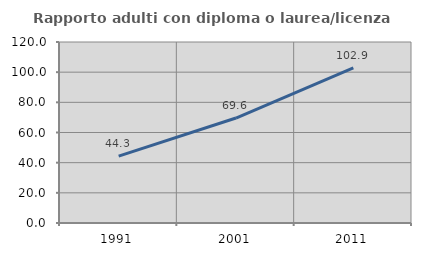
| Category | Rapporto adulti con diploma o laurea/licenza media  |
|---|---|
| 1991.0 | 44.315 |
| 2001.0 | 69.593 |
| 2011.0 | 102.916 |